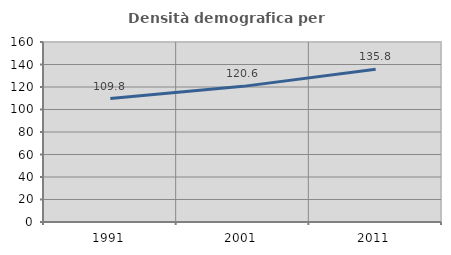
| Category | Densità demografica |
|---|---|
| 1991.0 | 109.764 |
| 2001.0 | 120.565 |
| 2011.0 | 135.8 |